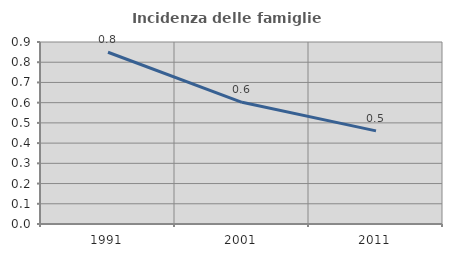
| Category | Incidenza delle famiglie numerose |
|---|---|
| 1991.0 | 0.849 |
| 2001.0 | 0.602 |
| 2011.0 | 0.461 |